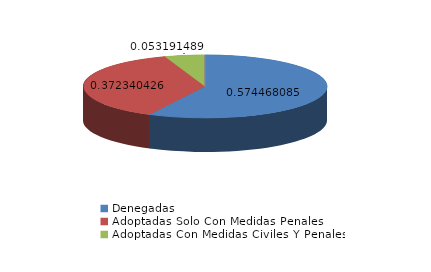
| Category | Series 0 |
|---|---|
| Denegadas | 54 |
| Adoptadas Solo Con Medidas Penales | 35 |
| Adoptadas Con Medidas Civiles Y Penales | 5 |
| Adoptadas Con Medidas Solo Civiles | 0 |